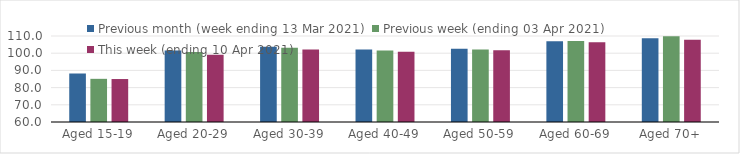
| Category | Previous month (week ending 13 Mar 2021) | Previous week (ending 03 Apr 2021) | This week (ending 10 Apr 2021) |
|---|---|---|---|
| Aged 15-19 | 88.2 | 85.1 | 84.98 |
| Aged 20-29 | 101.64 | 100.73 | 99.06 |
| Aged 30-39 | 103.76 | 103.23 | 102.17 |
| Aged 40-49 | 102.17 | 101.55 | 100.88 |
| Aged 50-59 | 102.63 | 102.19 | 101.71 |
| Aged 60-69 | 106.99 | 107.14 | 106.43 |
| Aged 70+ | 108.67 | 109.82 | 107.88 |